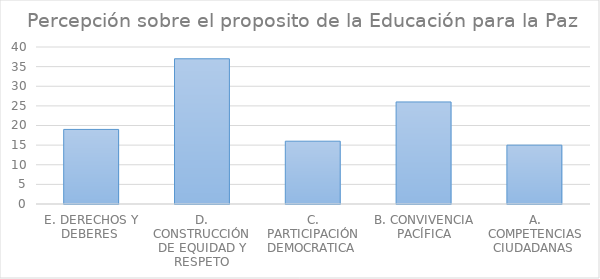
| Category | Series 0 |
|---|---|
| E. DERECHOS Y DEBERES  | 19 |
| D. CONSTRUCCIÓN DE EQUIDAD Y RESPETO | 37 |
| C. PARTICIPACIÓN DEMOCRATICA  | 16 |
| B. CONVIVENCIA PACÍFICA | 26 |
| A. COMPETENCIAS CIUDADANAS  | 15 |